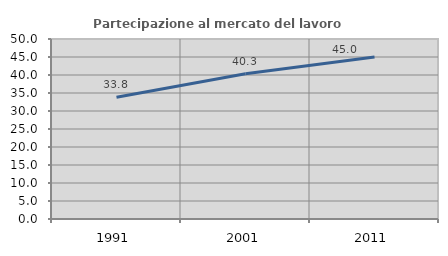
| Category | Partecipazione al mercato del lavoro  femminile |
|---|---|
| 1991.0 | 33.834 |
| 2001.0 | 40.341 |
| 2011.0 | 45.019 |